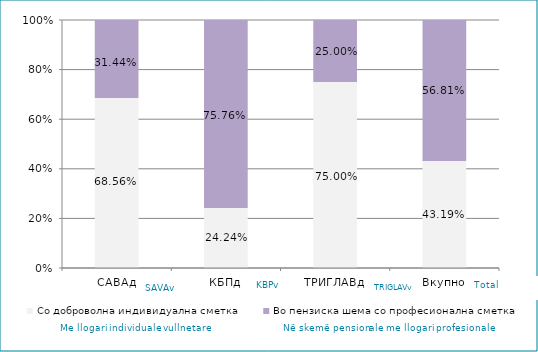
| Category | Со доброволна индивидуална сметка  | Во пензиска шема со професионална сметка |
|---|---|---|
| САВАд | 0.686 | 0.314 |
| КБПд | 0.242 | 0.758 |
| ТРИГЛАВд | 0.75 | 0.25 |
| Вкупно | 0.432 | 0.568 |